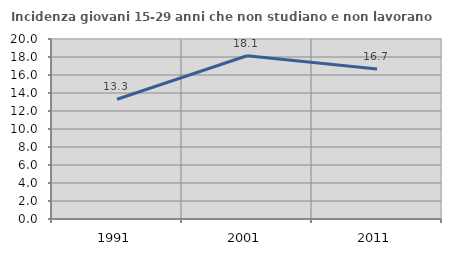
| Category | Incidenza giovani 15-29 anni che non studiano e non lavorano  |
|---|---|
| 1991.0 | 13.303 |
| 2001.0 | 18.14 |
| 2011.0 | 16.667 |